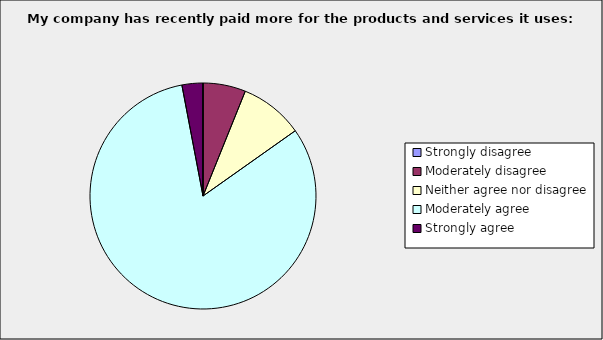
| Category | Series 0 |
|---|---|
| Strongly disagree | 0 |
| Moderately disagree | 0.061 |
| Neither agree nor disagree | 0.091 |
| Moderately agree | 0.818 |
| Strongly agree | 0.03 |